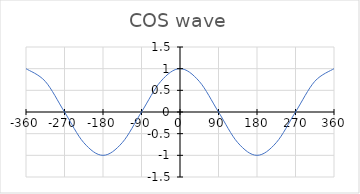
| Category | Series 1 |
|---|---|
| -360.0 | 1 |
| -315.0 | 0.707 |
| -270.0 | 0 |
| -225.0 | -0.707 |
| -180.0 | -1 |
| -135.0 | -0.707 |
| -90.0 | 0 |
| -45.0 | 0.707 |
| 0.0 | 1 |
| 45.0 | 0.707 |
| 90.0 | 0 |
| 135.0 | -0.707 |
| 180.0 | -1 |
| 225.0 | -0.707 |
| 270.0 | 0 |
| 315.0 | 0.707 |
| 360.0 | 1 |